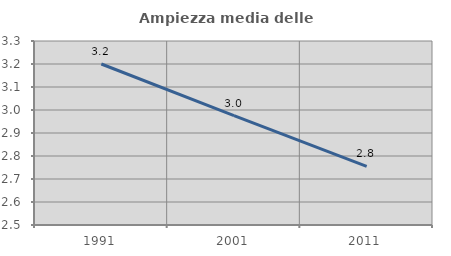
| Category | Ampiezza media delle famiglie |
|---|---|
| 1991.0 | 3.2 |
| 2001.0 | 2.976 |
| 2011.0 | 2.755 |